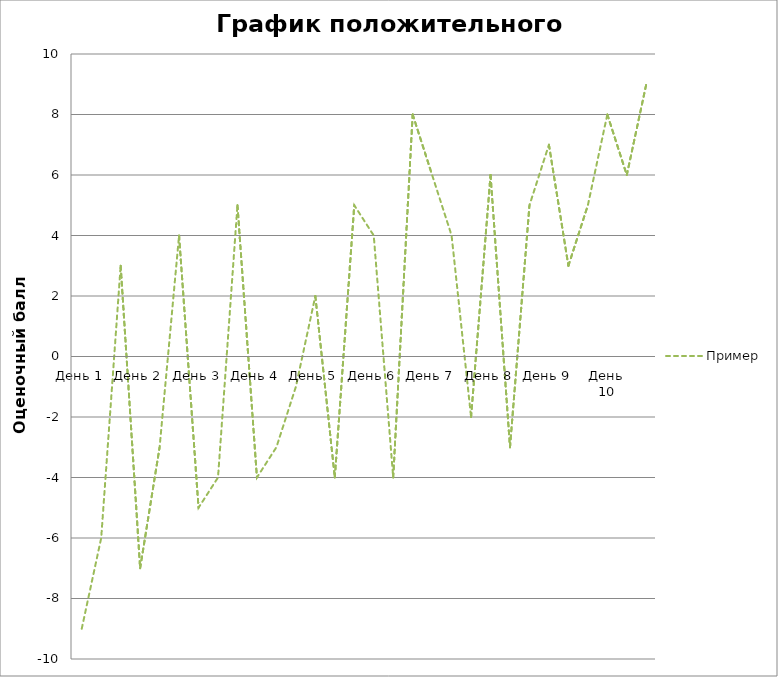
| Category | Пример |
|---|---|
| День 1 | -9 |
|  | -6 |
|  | 3 |
| День 2 | -7 |
|  | -3 |
|  | 4 |
| День 3 | -5 |
|  | -4 |
|  | 5 |
| День 4 | -4 |
|  | -3 |
|  | -1 |
| День 5 | 2 |
|  | -4 |
|  | 5 |
| День 6 | 4 |
|  | -4 |
|  | 8 |
| День 7 | 6 |
|  | 4 |
|  | -2 |
| День 8 | 6 |
|  | -3 |
|  | 5 |
| День 9 | 7 |
|  | 3 |
|  | 5 |
| День 10 | 8 |